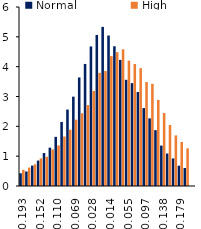
| Category | Normal | High |
|---|---|---|
| -0.193085783385048 | 0.427 | 0.541 |
| -0.179293941714688 | 0.486 | 0.618 |
| -0.165502100044327 | 0.683 | 0.727 |
| -0.151710258373966 | 0.853 | 0.924 |
| -0.137918416703606 | 1.106 | 0.98 |
| -0.124126575033245 | 1.285 | 1.226 |
| -0.110334733362885 | 1.647 | 1.361 |
| -0.096542891692524 | 2.148 | 1.658 |
| -0.0827510500221635 | 2.562 | 1.886 |
| -0.0689592083518029 | 2.994 | 2.223 |
| -0.0551673666814423 | 3.638 | 2.438 |
| -0.0413755250110817 | 4.091 | 2.713 |
| -0.0275836833407212 | 4.678 | 3.185 |
| -0.0137918416703606 | 5.063 | 3.792 |
| 0.0 | 5.333 | 3.854 |
| 0.0137918416703606 | 5.043 | 4.355 |
| 0.0275836833407211 | 4.683 | 4.485 |
| 0.0413755250110817 | 4.227 | 4.583 |
| 0.0551673666814423 | 3.559 | 4.202 |
| 0.0689592083518029 | 3.449 | 4.089 |
| 0.0827510500221635 | 3.15 | 3.951 |
| 0.096542891692524 | 2.611 | 3.484 |
| 0.110334733362885 | 2.267 | 3.424 |
| 0.124126575033245 | 1.872 | 2.885 |
| 0.137918416703606 | 1.356 | 2.447 |
| 0.151710258373966 | 1.089 | 2.043 |
| 0.165502100044327 | 0.924 | 1.695 |
| 0.179293941714688 | 0.68 | 1.478 |
| 0.193085783385048 | 0.602 | 1.261 |
| 0.206877625055409 | 0 | 0.002 |